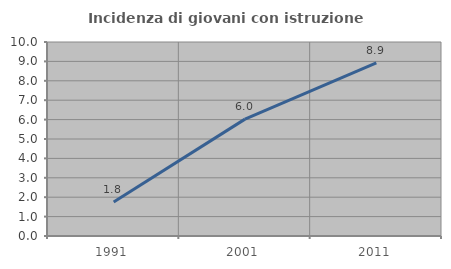
| Category | Incidenza di giovani con istruzione universitaria |
|---|---|
| 1991.0 | 1.754 |
| 2001.0 | 6.024 |
| 2011.0 | 8.929 |